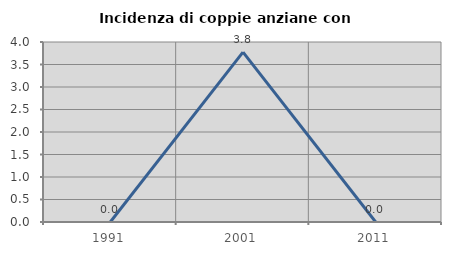
| Category | Incidenza di coppie anziane con figli |
|---|---|
| 1991.0 | 0 |
| 2001.0 | 3.774 |
| 2011.0 | 0 |